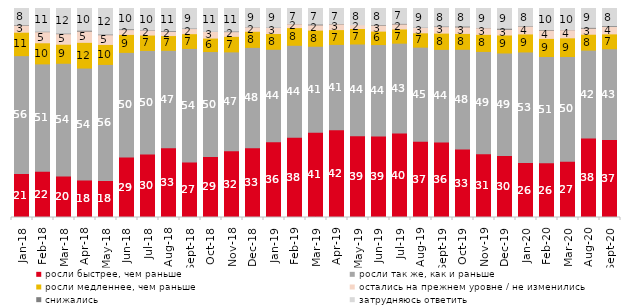
| Category | росли быстрее, чем раньше | росли так же, как и раньше | росли медленнее, чем раньше | остались на прежнем уровне / не изменились | снижались | затрудняюсь ответить |
|---|---|---|---|---|---|---|
| 2018-01-01 | 21.1 | 56.35 | 11.2 | 3.35 | 0.25 | 7.75 |
| 2018-02-01 | 22.1 | 51.4 | 10.1 | 5.3 | 0.2 | 10.9 |
| 2018-03-01 | 19.8 | 54 | 9.1 | 5.05 | 0.25 | 11.8 |
| 2018-04-01 | 17.95 | 53.55 | 12.3 | 5.35 | 0.45 | 10.4 |
| 2018-05-01 | 17.75 | 55.5 | 9.55 | 4.65 | 0.3 | 12.25 |
| 2018-06-01 | 28.9 | 50.1 | 8.6 | 2.3 | 0.35 | 9.75 |
| 2018-07-01 | 30.35 | 49.6 | 7.35 | 2.4 | 0.15 | 10.15 |
| 2018-08-01 | 33.35 | 46.65 | 7.05 | 2 | 0.35 | 10.6 |
| 2018-09-01 | 26.55 | 54.35 | 7.05 | 2.45 | 0.2 | 9.4 |
| 2018-10-01 | 29.2 | 50.2 | 6.45 | 3.15 | 0.05 | 10.95 |
| 2018-11-01 | 31.886 | 47.355 | 7.435 | 2.246 | 0.299 | 10.778 |
| 2018-12-01 | 33.4 | 48 | 7.7 | 2.1 | 0.05 | 8.75 |
| 2019-01-01 | 36.25 | 44.25 | 7.55 | 2.85 | 0.1 | 9 |
| 2019-02-01 | 38.35 | 44.05 | 8.45 | 1.85 | 0.05 | 7.25 |
| 2019-03-01 | 40.825 | 41.124 | 7.708 | 2.486 | 0.398 | 7.459 |
| 2019-04-01 | 42.03 | 40.792 | 7.079 | 2.723 | 0.149 | 7.228 |
| 2019-05-01 | 39.079 | 43.933 | 7.429 | 1.783 | 0 | 7.776 |
| 2019-06-01 | 39.052 | 43.691 | 6.434 | 2.843 | 0.249 | 7.731 |
| 2019-07-01 | 40.396 | 43.02 | 6.782 | 2.376 | 0.297 | 7.129 |
| 2019-08-01 | 36.513 | 45.005 | 6.843 | 2.547 | 0.1 | 8.991 |
| 2019-09-01 | 36.139 | 44.307 | 7.772 | 3.119 | 0.248 | 8.416 |
| 2019-10-01 | 32.822 | 47.673 | 7.574 | 3.119 | 0.396 | 8.416 |
| 2019-11-01 | 30.545 | 48.911 | 8.168 | 3.168 | 0.099 | 9.109 |
| 2019-12-01 | 29.653 | 49.059 | 8.614 | 2.723 | 0.495 | 9.455 |
| 2020-01-01 | 26.287 | 52.921 | 8.614 | 3.713 | 0.149 | 8.317 |
| 2020-02-01 | 26.139 | 50.891 | 8.663 | 3.96 | 0.297 | 10.05 |
| 2020-03-01 | 26.971 | 50.074 | 8.924 | 3.867 | 0.099 | 10.064 |
| 2020-08-01 | 38.083 | 42.006 | 7.597 | 2.88 | 0.397 | 9.037 |
| 2020-09-01 | 37.282 | 43.454 | 7.118 | 3.534 | 0.348 | 8.263 |